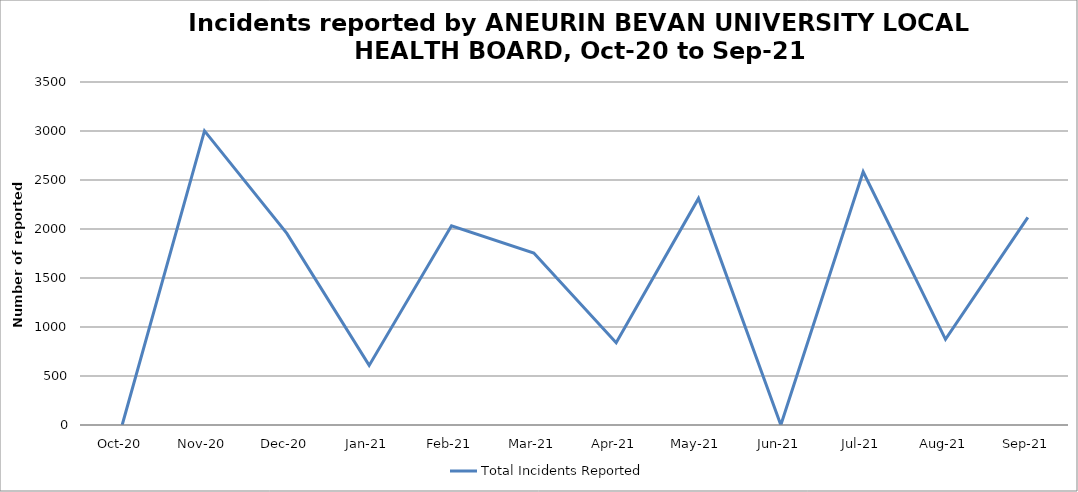
| Category | Total Incidents Reported |
|---|---|
| Oct-20 | 0 |
| Nov-20 | 3001 |
| Dec-20 | 1955 |
| Jan-21 | 608 |
| Feb-21 | 2033 |
| Mar-21 | 1755 |
| Apr-21 | 840 |
| May-21 | 2312 |
| Jun-21 | 0 |
| Jul-21 | 2584 |
| Aug-21 | 874 |
| Sep-21 | 2118 |